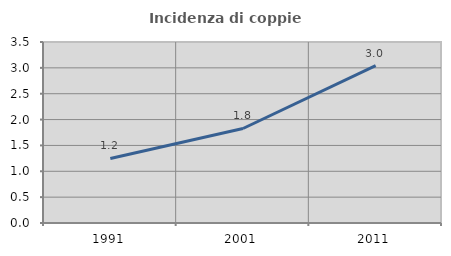
| Category | Incidenza di coppie miste |
|---|---|
| 1991.0 | 1.248 |
| 2001.0 | 1.828 |
| 2011.0 | 3.043 |